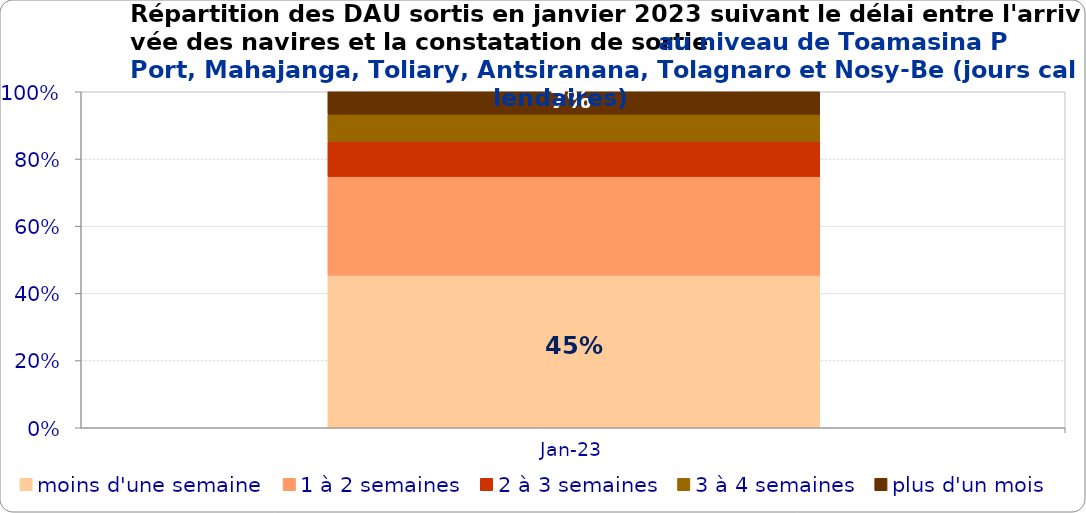
| Category | moins d'une semaine | 1 à 2 semaines | 2 à 3 semaines | 3 à 4 semaines | plus d'un mois |
|---|---|---|---|---|---|
| 2023-01-01 | 0.454 | 0.294 | 0.104 | 0.081 | 0.067 |